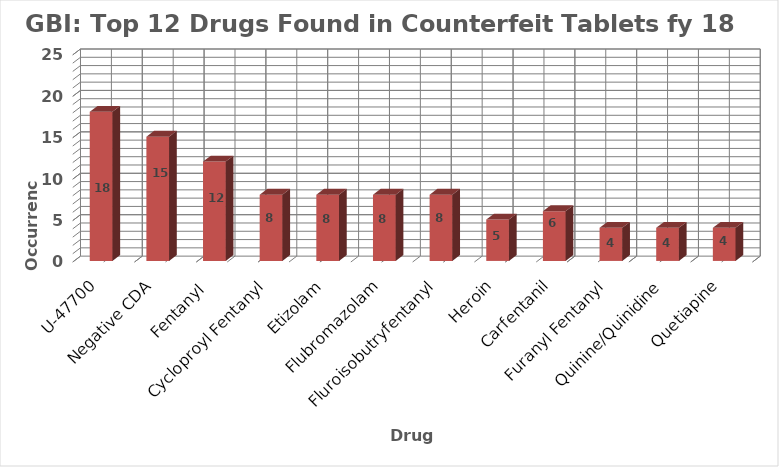
| Category | Series 0 |
|---|---|
| U-47700 | 18 |
| Negative CDA | 15 |
| Fentanyl  | 12 |
| Cycloproyl Fentanyl | 8 |
| Etizolam | 8 |
| Flubromazolam | 8 |
| Fluroisobutryfentanyl | 8 |
| Heroin | 5 |
| Carfentanil | 6 |
| Furanyl Fentanyl | 4 |
| Quinine/Quinidine | 4 |
| Quetiapine | 4 |